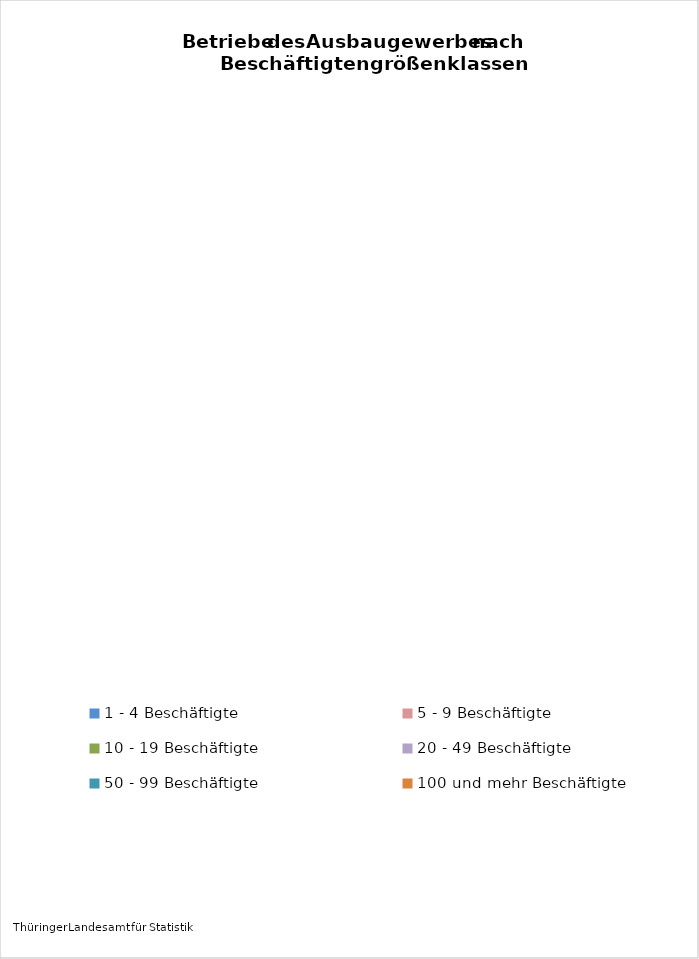
| Category | Anzahl Betriebe 2016 |
|---|---|
| 1 - 4 Beschäftigte | 3 |
| 5 - 9 Beschäftigte | 15 |
| 10 - 19 Beschäftigte | 347 |
| 20 - 49 Beschäftigte | 202 |
| 50 - 99 Beschäftigte | 29 |
| 100 und mehr Beschäftigte | 8 |